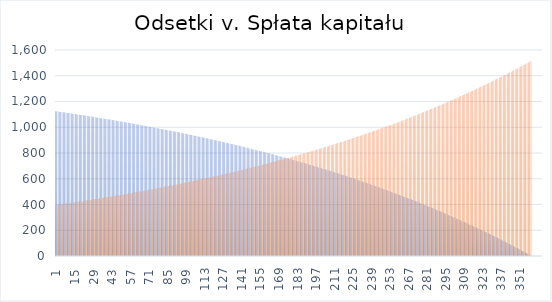
| Category | odsteki miesięczne | kwota spłaty kredytu |
|---|---|---|
| 1 | 1125 | 395.056 |
| 2 | 1123.519 | 396.537 |
| 3 | 1122.032 | 398.024 |
| 4 | 1120.539 | 399.517 |
| 5 | 1119.041 | 401.015 |
| 6 | 1117.537 | 402.519 |
| 7 | 1116.027 | 404.028 |
| 8 | 1114.512 | 405.544 |
| 9 | 1112.992 | 407.064 |
| 10 | 1111.465 | 408.591 |
| 11 | 1109.933 | 410.123 |
| 12 | 1108.395 | 411.661 |
| 13 | 1106.851 | 413.205 |
| 14 | 1105.302 | 414.754 |
| 15 | 1103.746 | 416.31 |
| 16 | 1102.185 | 417.871 |
| 17 | 1100.618 | 419.438 |
| 18 | 1099.045 | 421.011 |
| 19 | 1097.466 | 422.589 |
| 20 | 1095.882 | 424.174 |
| 21 | 1094.291 | 425.765 |
| 22 | 1092.695 | 427.361 |
| 23 | 1091.092 | 428.964 |
| 24 | 1089.483 | 430.573 |
| 25 | 1087.869 | 432.187 |
| 26 | 1086.248 | 433.808 |
| 27 | 1084.621 | 435.435 |
| 28 | 1082.988 | 437.068 |
| 29 | 1081.349 | 438.707 |
| 30 | 1079.704 | 440.352 |
| 31 | 1078.053 | 442.003 |
| 32 | 1076.395 | 443.661 |
| 33 | 1074.732 | 445.324 |
| 34 | 1073.062 | 446.994 |
| 35 | 1071.385 | 448.671 |
| 36 | 1069.703 | 450.353 |
| 37 | 1068.014 | 452.042 |
| 38 | 1066.319 | 453.737 |
| 39 | 1064.617 | 455.439 |
| 40 | 1062.909 | 457.146 |
| 41 | 1061.195 | 458.861 |
| 42 | 1059.474 | 460.581 |
| 43 | 1057.747 | 462.309 |
| 44 | 1056.014 | 464.042 |
| 45 | 1054.273 | 465.782 |
| 46 | 1052.527 | 467.529 |
| 47 | 1050.774 | 469.282 |
| 48 | 1049.014 | 471.042 |
| 49 | 1047.247 | 472.809 |
| 50 | 1045.474 | 474.582 |
| 51 | 1043.695 | 476.361 |
| 52 | 1041.908 | 478.148 |
| 53 | 1040.115 | 479.941 |
| 54 | 1038.315 | 481.741 |
| 55 | 1036.509 | 483.547 |
| 56 | 1034.696 | 485.36 |
| 57 | 1032.875 | 487.18 |
| 58 | 1031.049 | 489.007 |
| 59 | 1029.215 | 490.841 |
| 60 | 1027.374 | 492.682 |
| 61 | 1025.527 | 494.529 |
| 62 | 1023.672 | 496.384 |
| 63 | 1021.811 | 498.245 |
| 64 | 1019.942 | 500.114 |
| 65 | 1018.067 | 501.989 |
| 66 | 1016.184 | 503.872 |
| 67 | 1014.295 | 505.761 |
| 68 | 1012.398 | 507.658 |
| 69 | 1010.494 | 509.561 |
| 70 | 1008.584 | 511.472 |
| 71 | 1006.666 | 513.39 |
| 72 | 1004.74 | 515.316 |
| 73 | 1002.808 | 517.248 |
| 74 | 1000.868 | 519.188 |
| 75 | 998.921 | 521.135 |
| 76 | 996.967 | 523.089 |
| 77 | 995.006 | 525.05 |
| 78 | 993.037 | 527.019 |
| 79 | 991.06 | 528.996 |
| 80 | 989.077 | 530.979 |
| 81 | 987.085 | 532.971 |
| 82 | 985.087 | 534.969 |
| 83 | 983.081 | 536.975 |
| 84 | 981.067 | 538.989 |
| 85 | 979.046 | 541.01 |
| 86 | 977.017 | 543.039 |
| 87 | 974.981 | 545.075 |
| 88 | 972.936 | 547.119 |
| 89 | 970.885 | 549.171 |
| 90 | 968.825 | 551.231 |
| 91 | 966.758 | 553.298 |
| 92 | 964.683 | 555.373 |
| 93 | 962.601 | 557.455 |
| 94 | 960.51 | 559.546 |
| 95 | 958.412 | 561.644 |
| 96 | 956.306 | 563.75 |
| 97 | 954.192 | 565.864 |
| 98 | 952.07 | 567.986 |
| 99 | 949.94 | 570.116 |
| 100 | 947.802 | 572.254 |
| 101 | 945.656 | 574.4 |
| 102 | 943.502 | 576.554 |
| 103 | 941.34 | 578.716 |
| 104 | 939.17 | 580.886 |
| 105 | 936.991 | 583.065 |
| 106 | 934.805 | 585.251 |
| 107 | 932.61 | 587.446 |
| 108 | 930.407 | 589.649 |
| 109 | 928.196 | 591.86 |
| 110 | 925.977 | 594.079 |
| 111 | 923.749 | 596.307 |
| 112 | 921.513 | 598.543 |
| 113 | 919.268 | 600.788 |
| 114 | 917.015 | 603.041 |
| 115 | 914.754 | 605.302 |
| 116 | 912.484 | 607.572 |
| 117 | 910.205 | 609.85 |
| 118 | 907.919 | 612.137 |
| 119 | 905.623 | 614.433 |
| 120 | 903.319 | 616.737 |
| 121 | 901.006 | 619.05 |
| 122 | 898.685 | 621.371 |
| 123 | 896.355 | 623.701 |
| 124 | 894.016 | 626.04 |
| 125 | 891.668 | 628.388 |
| 126 | 889.312 | 630.744 |
| 127 | 886.946 | 633.11 |
| 128 | 884.572 | 635.484 |
| 129 | 882.189 | 637.867 |
| 130 | 879.797 | 640.259 |
| 131 | 877.396 | 642.66 |
| 132 | 874.986 | 645.07 |
| 133 | 872.567 | 647.489 |
| 134 | 870.139 | 649.917 |
| 135 | 867.702 | 652.354 |
| 136 | 865.256 | 654.8 |
| 137 | 862.8 | 657.256 |
| 138 | 860.335 | 659.721 |
| 139 | 857.861 | 662.195 |
| 140 | 855.378 | 664.678 |
| 141 | 852.886 | 667.17 |
| 142 | 850.384 | 669.672 |
| 143 | 847.872 | 672.184 |
| 144 | 845.352 | 674.704 |
| 145 | 842.822 | 677.234 |
| 146 | 840.282 | 679.774 |
| 147 | 837.733 | 682.323 |
| 148 | 835.174 | 684.882 |
| 149 | 832.606 | 687.45 |
| 150 | 830.028 | 690.028 |
| 151 | 827.44 | 692.616 |
| 152 | 824.843 | 695.213 |
| 153 | 822.236 | 697.82 |
| 154 | 819.619 | 700.437 |
| 155 | 816.992 | 703.064 |
| 156 | 814.356 | 705.7 |
| 157 | 811.71 | 708.346 |
| 158 | 809.053 | 711.003 |
| 159 | 806.387 | 713.669 |
| 160 | 803.711 | 716.345 |
| 161 | 801.024 | 719.031 |
| 162 | 798.328 | 721.728 |
| 163 | 795.622 | 724.434 |
| 164 | 792.905 | 727.151 |
| 165 | 790.178 | 729.878 |
| 166 | 787.441 | 732.615 |
| 167 | 784.694 | 735.362 |
| 168 | 781.936 | 738.12 |
| 169 | 779.168 | 740.888 |
| 170 | 776.39 | 743.666 |
| 171 | 773.601 | 746.455 |
| 172 | 770.802 | 749.254 |
| 173 | 767.992 | 752.064 |
| 174 | 765.172 | 754.884 |
| 175 | 762.341 | 757.715 |
| 176 | 759.5 | 760.556 |
| 177 | 756.648 | 763.408 |
| 178 | 753.785 | 766.271 |
| 179 | 750.911 | 769.145 |
| 180 | 748.027 | 772.029 |
| 181 | 745.132 | 774.924 |
| 182 | 742.226 | 777.83 |
| 183 | 739.309 | 780.747 |
| 184 | 736.381 | 783.675 |
| 185 | 733.443 | 786.613 |
| 186 | 730.493 | 789.563 |
| 187 | 727.532 | 792.524 |
| 188 | 724.56 | 795.496 |
| 189 | 721.577 | 798.479 |
| 190 | 718.583 | 801.473 |
| 191 | 715.577 | 804.479 |
| 192 | 712.56 | 807.496 |
| 193 | 709.532 | 810.524 |
| 194 | 706.493 | 813.563 |
| 195 | 703.442 | 816.614 |
| 196 | 700.379 | 819.676 |
| 197 | 697.306 | 822.75 |
| 198 | 694.22 | 825.836 |
| 199 | 691.124 | 828.932 |
| 200 | 688.015 | 832.041 |
| 201 | 684.895 | 835.161 |
| 202 | 681.763 | 838.293 |
| 203 | 678.619 | 841.437 |
| 204 | 675.464 | 844.592 |
| 205 | 672.297 | 847.759 |
| 206 | 669.118 | 850.938 |
| 207 | 665.927 | 854.129 |
| 208 | 662.724 | 857.332 |
| 209 | 659.509 | 860.547 |
| 210 | 656.282 | 863.774 |
| 211 | 653.042 | 867.013 |
| 212 | 649.791 | 870.265 |
| 213 | 646.528 | 873.528 |
| 214 | 643.252 | 876.804 |
| 215 | 639.964 | 880.092 |
| 216 | 636.664 | 883.392 |
| 217 | 633.351 | 886.705 |
| 218 | 630.026 | 890.03 |
| 219 | 626.688 | 893.368 |
| 220 | 623.338 | 896.718 |
| 221 | 619.975 | 900.081 |
| 222 | 616.6 | 903.456 |
| 223 | 613.212 | 906.844 |
| 224 | 609.811 | 910.245 |
| 225 | 606.398 | 913.658 |
| 226 | 602.972 | 917.084 |
| 227 | 599.533 | 920.523 |
| 228 | 596.081 | 923.975 |
| 229 | 592.616 | 927.44 |
| 230 | 589.138 | 930.918 |
| 231 | 585.647 | 934.409 |
| 232 | 582.143 | 937.913 |
| 233 | 578.626 | 941.43 |
| 234 | 575.095 | 944.961 |
| 235 | 571.552 | 948.504 |
| 236 | 567.995 | 952.061 |
| 237 | 564.425 | 955.631 |
| 238 | 560.841 | 959.215 |
| 239 | 557.244 | 962.812 |
| 240 | 553.633 | 966.422 |
| 241 | 550.009 | 970.047 |
| 242 | 546.372 | 973.684 |
| 243 | 542.72 | 977.336 |
| 244 | 539.055 | 981.001 |
| 245 | 535.377 | 984.679 |
| 246 | 531.684 | 988.372 |
| 247 | 527.978 | 992.078 |
| 248 | 524.257 | 995.799 |
| 249 | 520.523 | 999.533 |
| 250 | 516.775 | 1003.281 |
| 251 | 513.013 | 1007.043 |
| 252 | 509.236 | 1010.82 |
| 253 | 505.446 | 1014.61 |
| 254 | 501.641 | 1018.415 |
| 255 | 497.822 | 1022.234 |
| 256 | 493.988 | 1026.068 |
| 257 | 490.141 | 1029.915 |
| 258 | 486.278 | 1033.777 |
| 259 | 482.402 | 1037.654 |
| 260 | 478.511 | 1041.545 |
| 261 | 474.605 | 1045.451 |
| 262 | 470.684 | 1049.372 |
| 263 | 466.749 | 1053.307 |
| 264 | 462.799 | 1057.257 |
| 265 | 458.835 | 1061.221 |
| 266 | 454.855 | 1065.201 |
| 267 | 450.861 | 1069.195 |
| 268 | 446.851 | 1073.205 |
| 269 | 442.827 | 1077.229 |
| 270 | 438.787 | 1081.269 |
| 271 | 434.732 | 1085.324 |
| 272 | 430.662 | 1089.394 |
| 273 | 426.577 | 1093.479 |
| 274 | 422.476 | 1097.58 |
| 275 | 418.36 | 1101.695 |
| 276 | 414.229 | 1105.827 |
| 277 | 410.082 | 1109.974 |
| 278 | 405.92 | 1114.136 |
| 279 | 401.742 | 1118.314 |
| 280 | 397.548 | 1122.508 |
| 281 | 393.339 | 1126.717 |
| 282 | 389.114 | 1130.942 |
| 283 | 384.873 | 1135.183 |
| 284 | 380.616 | 1139.44 |
| 285 | 376.343 | 1143.713 |
| 286 | 372.054 | 1148.002 |
| 287 | 367.749 | 1152.307 |
| 288 | 363.428 | 1156.628 |
| 289 | 359.09 | 1160.966 |
| 290 | 354.737 | 1165.319 |
| 291 | 350.367 | 1169.689 |
| 292 | 345.98 | 1174.076 |
| 293 | 341.578 | 1178.478 |
| 294 | 337.158 | 1182.898 |
| 295 | 332.722 | 1187.333 |
| 296 | 328.27 | 1191.786 |
| 297 | 323.801 | 1196.255 |
| 298 | 319.315 | 1200.741 |
| 299 | 314.812 | 1205.244 |
| 300 | 310.292 | 1209.764 |
| 301 | 305.756 | 1214.3 |
| 302 | 301.202 | 1218.854 |
| 303 | 296.631 | 1223.425 |
| 304 | 292.044 | 1228.012 |
| 305 | 287.439 | 1232.617 |
| 306 | 282.816 | 1237.24 |
| 307 | 278.177 | 1241.879 |
| 308 | 273.519 | 1246.536 |
| 309 | 268.845 | 1251.211 |
| 310 | 264.153 | 1255.903 |
| 311 | 259.443 | 1260.613 |
| 312 | 254.716 | 1265.34 |
| 313 | 249.971 | 1270.085 |
| 314 | 245.208 | 1274.848 |
| 315 | 240.427 | 1279.628 |
| 316 | 235.629 | 1284.427 |
| 317 | 230.812 | 1289.244 |
| 318 | 225.978 | 1294.078 |
| 319 | 221.125 | 1298.931 |
| 320 | 216.254 | 1303.802 |
| 321 | 211.365 | 1308.691 |
| 322 | 206.457 | 1313.599 |
| 323 | 201.531 | 1318.525 |
| 324 | 196.587 | 1323.469 |
| 325 | 191.623 | 1328.432 |
| 326 | 186.642 | 1333.414 |
| 327 | 181.642 | 1338.414 |
| 328 | 176.623 | 1343.433 |
| 329 | 171.585 | 1348.471 |
| 330 | 166.528 | 1353.528 |
| 331 | 161.452 | 1358.604 |
| 332 | 156.357 | 1363.699 |
| 333 | 151.244 | 1368.812 |
| 334 | 146.11 | 1373.945 |
| 335 | 140.958 | 1379.098 |
| 336 | 135.787 | 1384.269 |
| 337 | 130.596 | 1389.46 |
| 338 | 125.385 | 1394.671 |
| 339 | 120.155 | 1399.901 |
| 340 | 114.905 | 1405.151 |
| 341 | 109.636 | 1410.42 |
| 342 | 104.347 | 1415.709 |
| 343 | 99.038 | 1421.018 |
| 344 | 93.709 | 1426.347 |
| 345 | 88.361 | 1431.695 |
| 346 | 82.992 | 1437.064 |
| 347 | 77.603 | 1442.453 |
| 348 | 72.193 | 1447.862 |
| 349 | 66.764 | 1453.292 |
| 350 | 61.314 | 1458.742 |
| 351 | 55.844 | 1464.212 |
| 352 | 50.353 | 1469.703 |
| 353 | 44.842 | 1475.214 |
| 354 | 39.31 | 1480.746 |
| 355 | 33.757 | 1486.299 |
| 356 | 28.183 | 1491.873 |
| 357 | 22.589 | 1497.467 |
| 358 | 16.973 | 1503.083 |
| 359 | 11.337 | 1508.719 |
| 360 | 5.679 | 1514.377 |